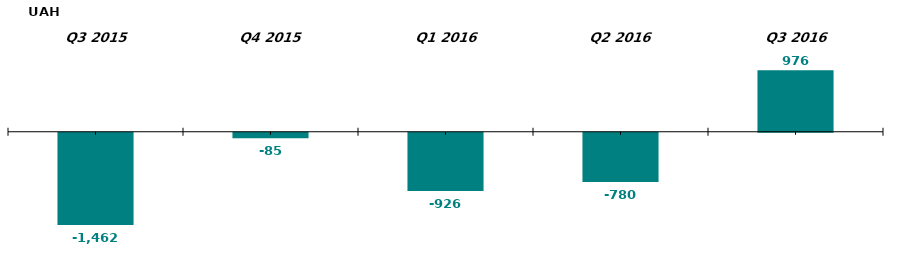
| Category | Net Inflow /Outflow in Open-Ended CII in Q3 2015-2016, UAH thsd. |
|---|---|
| Q3 2015 | -1462.468 |
| Q4 2015 | -85.402 |
| Q1 2016 | -926.322 |
| Q2 2016 | -780.358 |
| Q3 2016 | 975.567 |